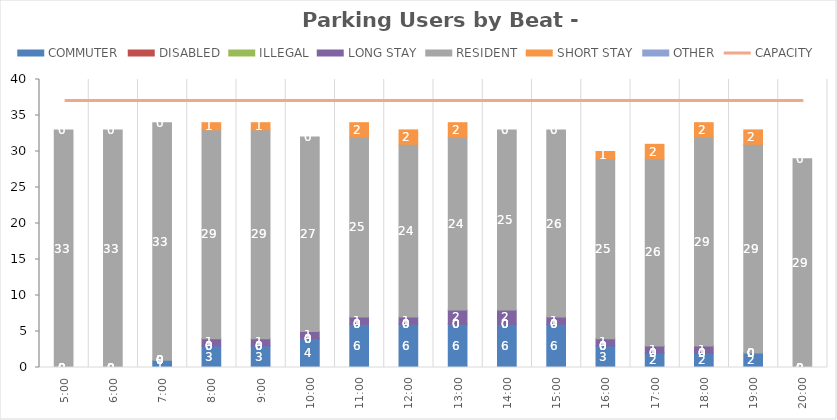
| Category | COMMUTER | DISABLED | ILLEGAL | LONG STAY | RESIDENT | SHORT STAY | OTHER |
|---|---|---|---|---|---|---|---|
| 0.20833333333333334 | 0 | 0 | 0 | 0 | 33 | 0 | 0 |
| 0.25 | 0 | 0 | 0 | 0 | 33 | 0 | 0 |
| 0.2916666666666667 | 1 | 0 | 0 | 0 | 33 | 0 | 0 |
| 0.3333333333333333 | 3 | 0 | 0 | 1 | 29 | 1 | 0 |
| 0.375 | 3 | 0 | 0 | 1 | 29 | 1 | 0 |
| 0.4166666666666667 | 4 | 0 | 0 | 1 | 27 | 0 | 0 |
| 0.4583333333333333 | 6 | 0 | 0 | 1 | 25 | 2 | 0 |
| 0.5 | 6 | 0 | 0 | 1 | 24 | 2 | 0 |
| 0.5416666666666666 | 6 | 0 | 0 | 2 | 24 | 2 | 0 |
| 0.5833333333333334 | 6 | 0 | 0 | 2 | 25 | 0 | 0 |
| 0.625 | 6 | 0 | 0 | 1 | 26 | 0 | 0 |
| 0.6666666666666666 | 3 | 0 | 0 | 1 | 25 | 1 | 0 |
| 0.7083333333333334 | 2 | 0 | 0 | 1 | 26 | 2 | 0 |
| 0.75 | 2 | 0 | 0 | 1 | 29 | 2 | 0 |
| 0.7916666666666666 | 2 | 0 | 0 | 0 | 29 | 2 | 0 |
| 0.8333333333333334 | 0 | 0 | 0 | 0 | 29 | 0 | 0 |